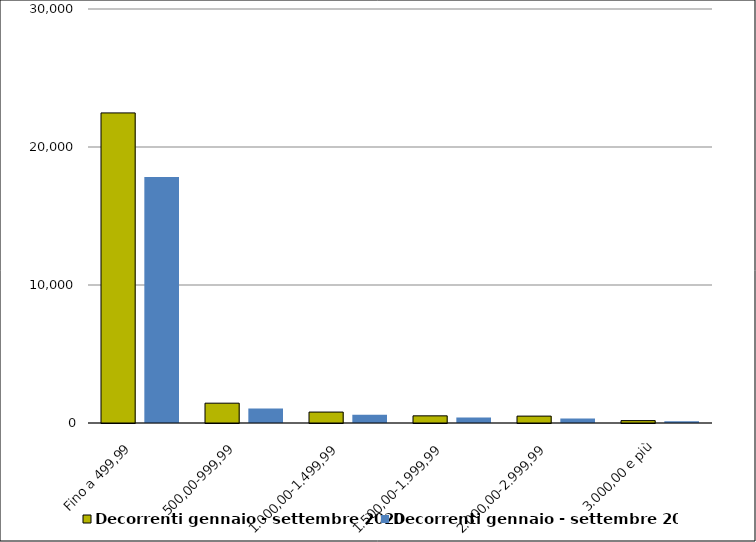
| Category | Decorrenti gennaio - settembre 2020 | Decorrenti gennaio - settembre 2019 |
|---|---|---|
| Fino a 499,99 | 22470 | 17832 |
| 500,00-999,99 | 1436 | 1050 |
| 1.000,00-1.499,99 | 792 | 598 |
| 1.500,00-1.999,99 | 518 | 405 |
| 2.000,00-2.999,99 | 499 | 327 |
| 3.000,00 e più | 173 | 127 |